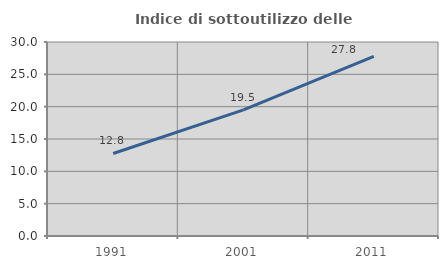
| Category | Indice di sottoutilizzo delle abitazioni  |
|---|---|
| 1991.0 | 12.761 |
| 2001.0 | 19.499 |
| 2011.0 | 27.783 |